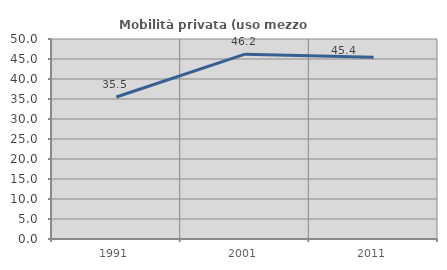
| Category | Mobilità privata (uso mezzo privato) |
|---|---|
| 1991.0 | 35.489 |
| 2001.0 | 46.213 |
| 2011.0 | 45.408 |